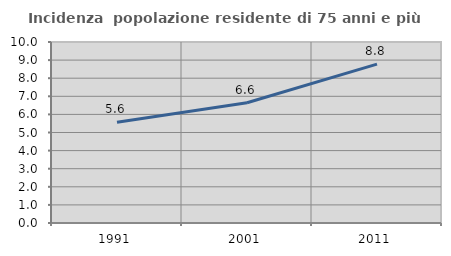
| Category | Incidenza  popolazione residente di 75 anni e più |
|---|---|
| 1991.0 | 5.56 |
| 2001.0 | 6.647 |
| 2011.0 | 8.78 |